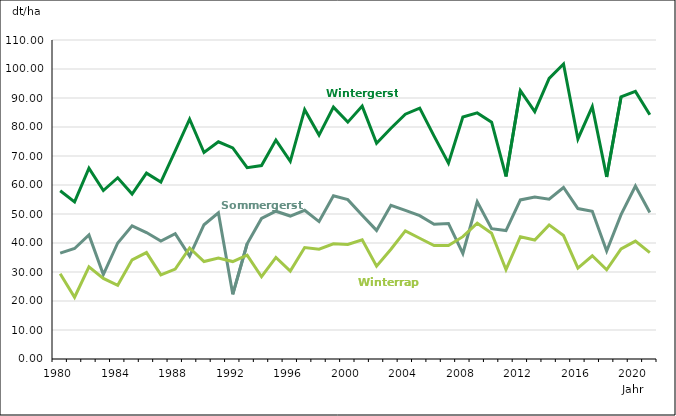
| Category | Wintergerste | Sommergerste | Winterraps |
|---|---|---|---|
| 1980.0 | 58 | 36.5 | 29.4 |
| 1981.0 | 54.2 | 38.1 | 21.3 |
| 1982.0 | 65.8 | 42.8 | 31.8 |
| 1983.0 | 58.1 | 29.1 | 27.8 |
| 1984.0 | 62.5 | 40 | 25.4 |
| 1985.0 | 56.9 | 45.9 | 34.2 |
| 1986.0 | 64.1 | 43.6 | 36.7 |
| 1987.0 | 61 | 40.7 | 29 |
| 1988.0 | 71.8 | 43.2 | 31 |
| 1989.0 | 82.7 | 35.5 | 38.3 |
| 1990.0 | 71.2 | 46.3 | 33.6 |
| 1991.0 | 74.9 | 50.4 | 34.8 |
| 1992.0 | 72.8 | 22.3 | 33.6 |
| 1993.0 | 65.95 | 39.75 | 35.8 |
| 1994.0 | 66.69 | 48.47 | 28.36 |
| 1995.0 | 75.47 | 50.96 | 35.03 |
| 1996.0 | 68.18 | 49.3 | 30.33 |
| 1997.0 | 85.97 | 51.27 | 38.44 |
| 1998.0 | 77.22 | 47.39 | 37.87 |
| 1999.0 | 86.85 | 56.28 | 39.7 |
| 2000.0 | 81.67 | 54.94 | 39.48 |
| 2001.0 | 87.2 | 49.6 | 41.11 |
| 2002.0 | 74.39 | 44.35 | 32.03 |
| 2003.0 | 79.59 | 53.01 | 37.85 |
| 2004.0 | 84.4 | 51.26 | 44.17 |
| 2005.0 | 86.52 | 49.41 | 41.65 |
| 2006.0 | 76.84 | 46.44 | 39.13 |
| 2007.0 | 67.54 | 46.74 | 39.1 |
| 2008.0 | 83.42 | 36.38 | 42.19 |
| 2009.0 | 84.86 | 54.2 | 46.83 |
| 2010.0 | 81.68 | 44.96 | 43.38 |
| 2011.0 | 62.94 | 44.3 | 30.79 |
| 2012.0 | 92.53 | 54.86 | 42.17 |
| 2013.0 | 85.3 | 55.86 | 41.04 |
| 2014.0 | 96.75 | 55.13 | 46.24 |
| 2015.0 | 101.72 | 59.13 | 42.56 |
| 2016.0 | 75.88 | 51.87 | 31.36 |
| 2017.0 | 87.06 | 50.91 | 35.6 |
| 2018.0 | 62.79 | 37.22 | 30.76 |
| 2019.0 | 90.38 | 49.78 | 37.97 |
| 2020.0 | 92.27 | 59.64 | 40.64 |
| 2021.0 | 84.21 | 50.53 | 36.66 |